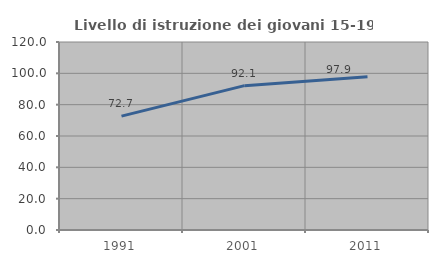
| Category | Livello di istruzione dei giovani 15-19 anni |
|---|---|
| 1991.0 | 72.688 |
| 2001.0 | 92.128 |
| 2011.0 | 97.884 |